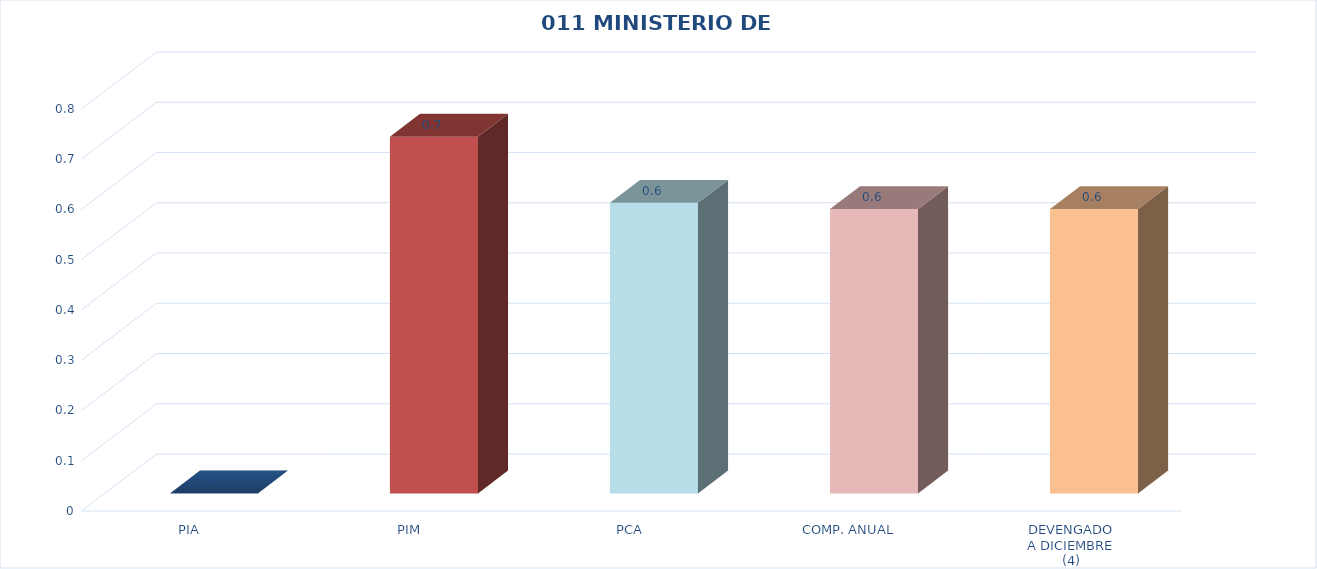
| Category | 011 MINISTERIO DE SALUD |
|---|---|
| PIA | 0 |
| PIM | 0.71 |
| PCA | 0.578 |
| COMP. ANUAL | 0.566 |
| DEVENGADO
A DICIEMBRE
(4) | 0.566 |